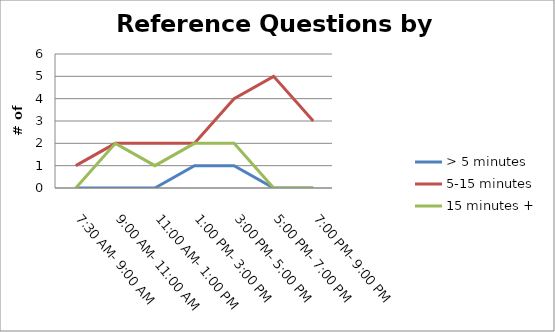
| Category | > 5 minutes | 5-15 minutes | 15 minutes + |
|---|---|---|---|
| 7:30 AM- 9:00 AM | 0 | 1 | 0 |
| 9:00 AM- 11:00 AM | 0 | 2 | 2 |
| 11:00 AM- 1:00 PM | 0 | 2 | 1 |
| 1:00 PM- 3:00 PM | 1 | 2 | 2 |
| 3:00 PM- 5:00 PM | 1 | 4 | 2 |
| 5:00 PM- 7:00 PM | 0 | 5 | 0 |
| 7:00 PM- 9:00 PM | 0 | 3 | 0 |